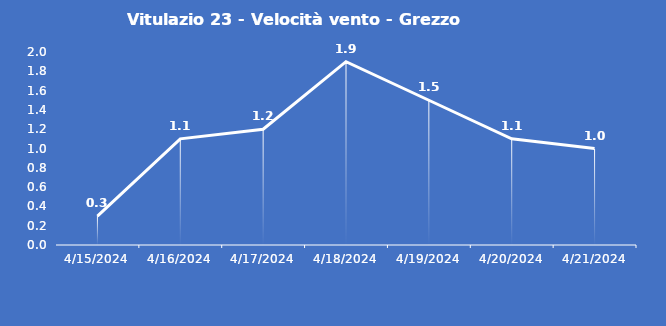
| Category | Vitulazio 23 - Velocità vento - Grezzo (m/s) |
|---|---|
| 4/15/24 | 0.3 |
| 4/16/24 | 1.1 |
| 4/17/24 | 1.2 |
| 4/18/24 | 1.9 |
| 4/19/24 | 1.5 |
| 4/20/24 | 1.1 |
| 4/21/24 | 1 |